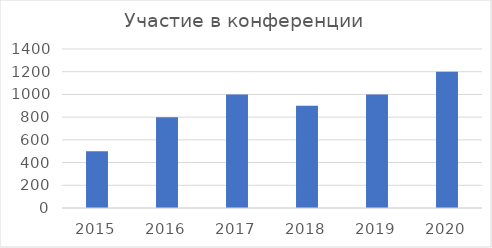
| Category | Участие в конференции |
|---|---|
| 2015.0 | 500 |
| 2016.0 | 800 |
| 2017.0 | 1000 |
| 2018.0 | 900 |
| 2019.0 | 1000 |
| 2020.0 | 1200 |